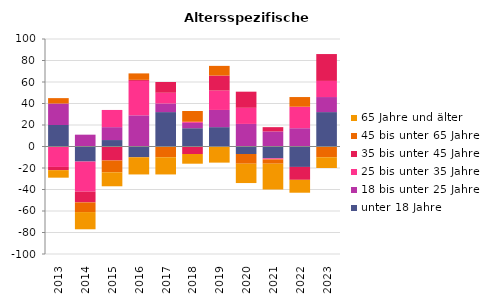
| Category | unter 18 Jahre | 18 bis unter 25 Jahre | 25 bis unter 35 Jahre | 35 bis unter 45 Jahre | 45 bis unter 65 Jahre | 65 Jahre und älter |
|---|---|---|---|---|---|---|
| 2013.0 | 20 | 20 | -19 | -3 | 5 | -7 |
| 2014.0 | -14 | 11 | -28 | -10 | -9 | -16 |
| 2015.0 | 6 | 12 | 16 | -13 | -11 | -13 |
| 2016.0 | -10 | 29 | 32 | 1 | 6 | -16 |
| 2017.0 | 32 | 8 | 10 | 10 | -10 | -16 |
| 2018.0 | 17 | 5 | 1 | -7 | 10 | -9 |
| 2019.0 | 18 | 16 | 18 | 14 | 9 | -15 |
| 2020.0 | -7 | 21 | 15 | 15 | -9 | -18 |
| 2021.0 | -11 | 14 | -1 | 4 | -4 | -24 |
| 2022.0 | -19 | 17 | 20 | -12 | 9 | -12 |
| 2023.0 | 32 | 14 | 15 | 25 | -10 | -10 |